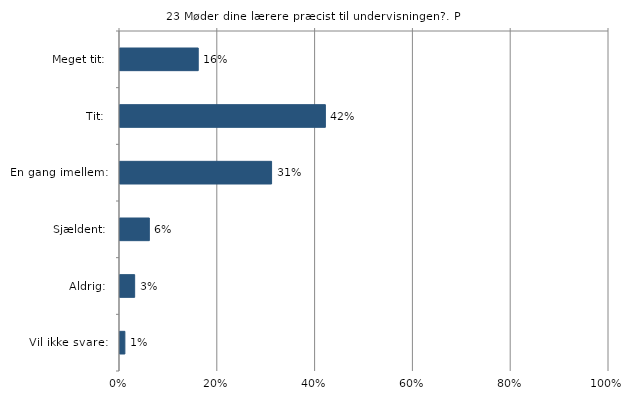
| Category | Møder dine lærere præcist til undervisningen? |
|---|---|
| Meget tit:  | 0.16 |
| Tit:  | 0.42 |
| En gang imellem:  | 0.31 |
| Sjældent:  | 0.06 |
| Aldrig:  | 0.03 |
| Vil ikke svare:  | 0.01 |